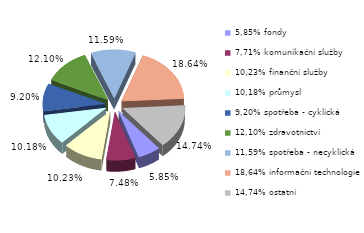
| Category | Series 0 |
|---|---|
| 5,85% fondy | 0.058 |
| 7,71% komunikační služby | 0.075 |
| 10,23% finanční služby | 0.102 |
| 10,18% průmysl | 0.102 |
| 9,20% spotřeba - cyklická | 0.092 |
| 12,10% zdravotnictví | 0.121 |
| 11,59% spotřeba - necyklická | 0.116 |
| 18,64% informační technologie | 0.186 |
| 14,74% ostatní | 0.147 |